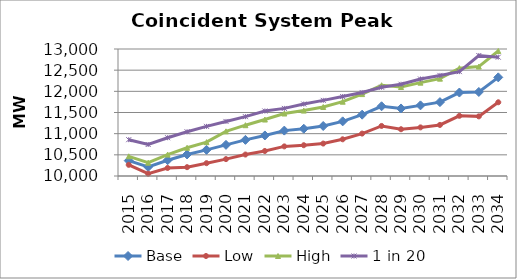
| Category | Base | Low | High | 1 in 20 |
|---|---|---|---|---|
| 2015.0 | 10362.57 | 10264 | 10464.92 | 10857.88 |
| 2016.0 | 10214.11 | 10053.46 | 10315.13 | 10743.88 |
| 2017.0 | 10372.87 | 10189.58 | 10504.98 | 10904.01 |
| 2018.0 | 10508.84 | 10208.54 | 10666.87 | 11044.94 |
| 2019.0 | 10617.66 | 10302.5 | 10799.76 | 11172.36 |
| 2020.0 | 10735.66 | 10398.78 | 11054.55 | 11288.96 |
| 2021.0 | 10853.5 | 10507.03 | 11200.28 | 11401.61 |
| 2022.0 | 10958 | 10590.71 | 11333.88 | 11534.94 |
| 2023.0 | 11072.24 | 10699.26 | 11475.95 | 11597.01 |
| 2024.0 | 11116 | 10726.78 | 11544.94 | 11699.82 |
| 2025.0 | 11181.04 | 10766.37 | 11629.88 | 11786.63 |
| 2026.0 | 11291.07 | 10867.14 | 11755.24 | 11877.34 |
| 2027.0 | 11448.83 | 11002.39 | 11935.13 | 11972.86 |
| 2028.0 | 11647.2 | 11182.19 | 12143.42 | 12096.2 |
| 2029.0 | 11595.59 | 11104.48 | 12102.1 | 12167.19 |
| 2030.0 | 11668.53 | 11148.19 | 12205.18 | 12291.27 |
| 2031.0 | 11745.32 | 11205.62 | 12299.51 | 12376.36 |
| 2032.0 | 11971.47 | 11421.74 | 12547.8 | 12465.66 |
| 2033.0 | 11985.07 | 11408.78 | 12584.32 | 12846.74 |
| 2034.0 | 12330.46 | 11741.4 | 12953.18 | 12806.97 |